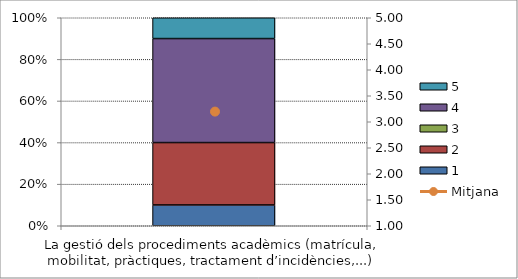
| Category | 1 | 2 | 3 | 4 | 5 |
|---|---|---|---|---|---|
| La gestió dels procediments acadèmics (matrícula, mobilitat, pràctiques, tractament d’incidències,...) | 1 | 3 | 0 | 5 | 1 |